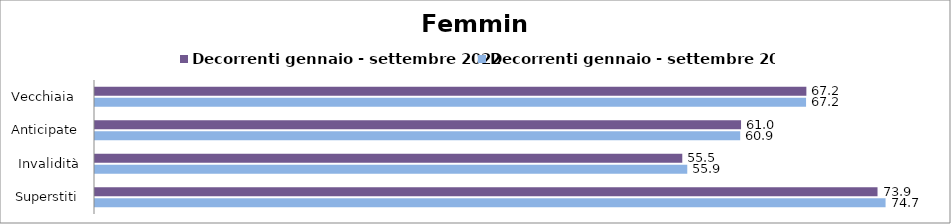
| Category | Decorrenti gennaio - settembre 2022 | Decorrenti gennaio - settembre 2023 |
|---|---|---|
| Vecchiaia  | 67.19 | 67.16 |
| Anticipate | 61.02 | 60.94 |
| Invalidità | 55.47 | 55.94 |
| Superstiti | 73.91 | 74.67 |